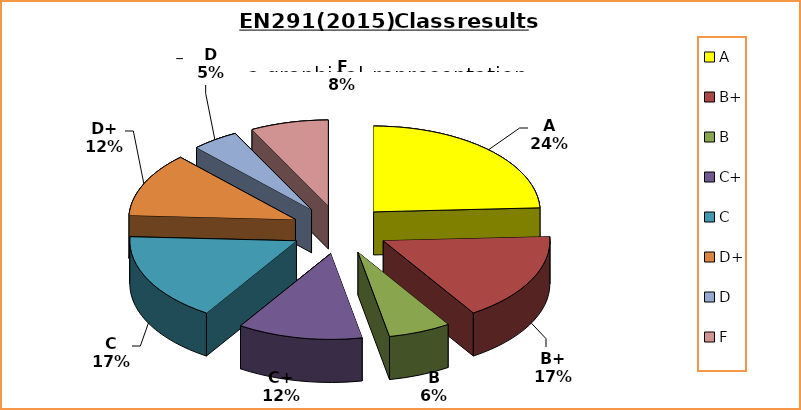
| Category | Series 0 |
|---|---|
| A | 16 |
| B+ | 11 |
| B | 4 |
| C+ | 8 |
| C | 11 |
| D+ | 8 |
| D | 3 |
| F | 5 |